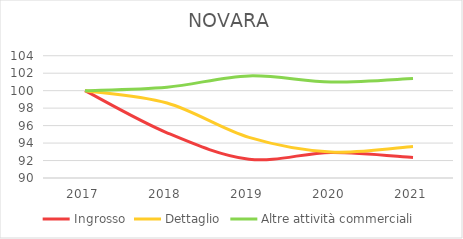
| Category | Ingrosso | Dettaglio | Altre attività commerciali |
|---|---|---|---|
| 2017.0 | 100 | 100 | 100 |
| 2018.0 | 95.175 | 98.588 | 100.398 |
| 2019.0 | 92.151 | 94.654 | 101.693 |
| 2020.0 | 92.932 | 92.978 | 100.996 |
| 2021.0 | 92.355 | 93.618 | 101.394 |